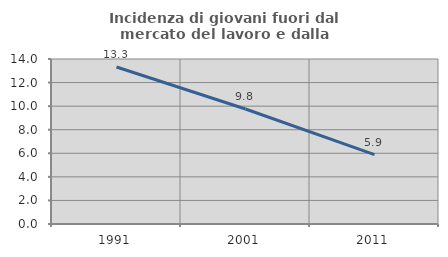
| Category | Incidenza di giovani fuori dal mercato del lavoro e dalla formazione  |
|---|---|
| 1991.0 | 13.321 |
| 2001.0 | 9.756 |
| 2011.0 | 5.888 |